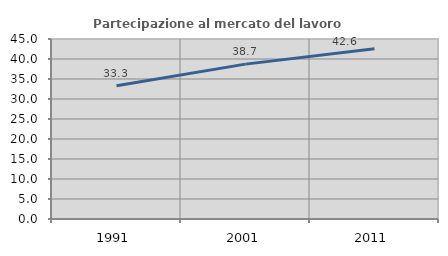
| Category | Partecipazione al mercato del lavoro  femminile |
|---|---|
| 1991.0 | 33.293 |
| 2001.0 | 38.716 |
| 2011.0 | 42.552 |